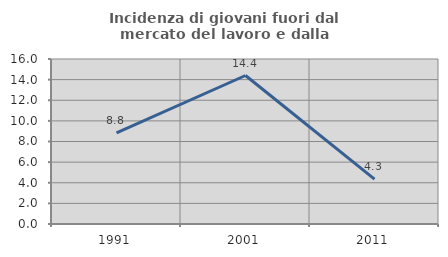
| Category | Incidenza di giovani fuori dal mercato del lavoro e dalla formazione  |
|---|---|
| 1991.0 | 8.844 |
| 2001.0 | 14.4 |
| 2011.0 | 4.348 |